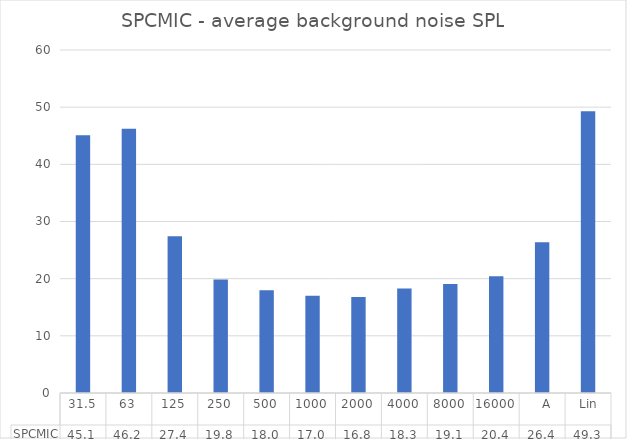
| Category | SPCMIC |
|---|---|
| 31.5 | 45.106 |
| 63 | 46.211 |
| 125 | 27.424 |
| 250 | 19.844 |
| 500 | 17.953 |
| 1000 | 16.992 |
| 2000 | 16.792 |
| 4000 | 18.295 |
| 8000 | 19.051 |
| 16000 | 20.402 |
|    A | 26.35 |
|  Lin | 49.283 |